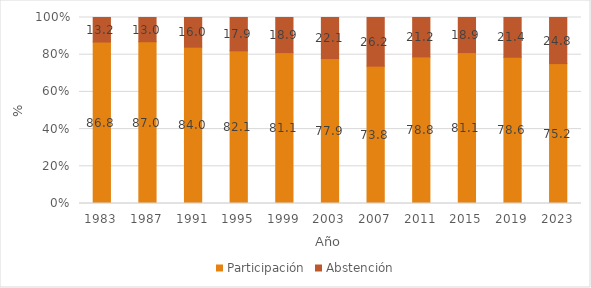
| Category | Participación | Abstención |
|---|---|---|
| 1983.0 | 86.803 | 13.197 |
| 1987.0 | 86.973 | 13.027 |
| 1991.0 | 84.038 | 15.962 |
| 1995.0 | 82.071 | 17.929 |
| 1999.0 | 81.112 | 18.888 |
| 2003.0 | 77.936 | 22.064 |
| 2007.0 | 73.837 | 26.163 |
| 2011.0 | 78.8 | 21.2 |
| 2015.0 | 81.127 | 18.873 |
| 2019.0 | 78.624 | 21.376 |
| 2023.0 | 75.216 | 24.784 |